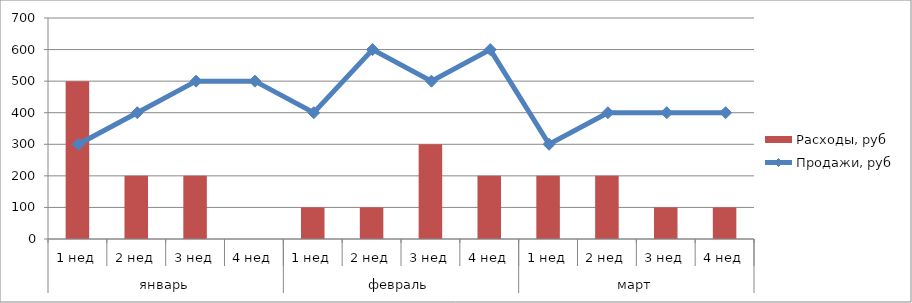
| Category | Расходы, руб |
|---|---|
| 0 | 500 |
| 1 | 200 |
| 2 | 200 |
| 3 | 0 |
| 4 | 100 |
| 5 | 100 |
| 6 | 300 |
| 7 | 200 |
| 8 | 200 |
| 9 | 200 |
| 10 | 100 |
| 11 | 100 |